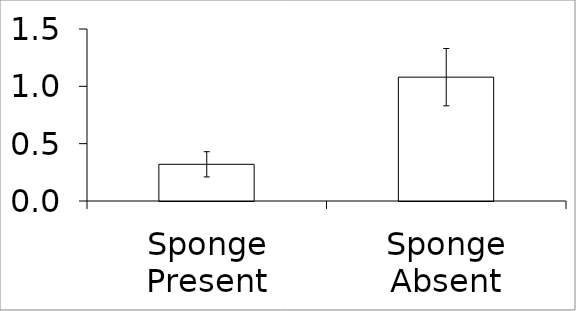
| Category | Series 0 |
|---|---|
| Sponge Present | 0.32 |
| Sponge Absent | 1.08 |